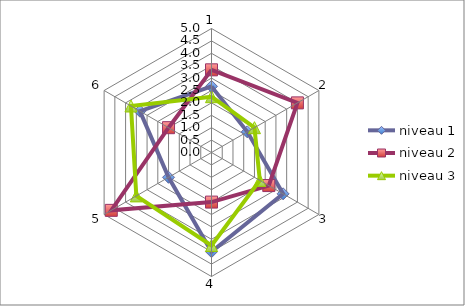
| Category | niveau 1 | niveau 2 | niveau 3 |
|---|---|---|---|
| 0 | 2.667 | 3.333 | 2.25 |
| 1 | 1.667 | 4 | 2 |
| 2 | 3.333 | 2.667 | 2.25 |
| 3 | 4 | 2 | 3.75 |
| 4 | 2 | 4.667 | 3.5 |
| 5 | 3.333 | 2 | 3.75 |